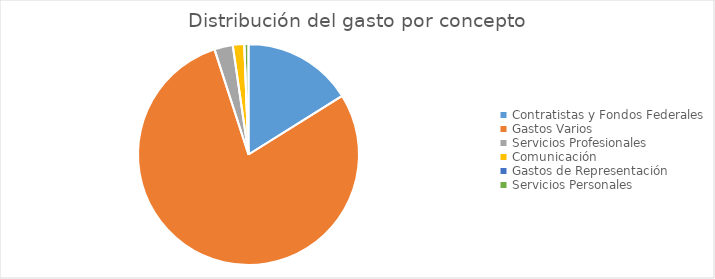
| Category | Series 0 |
|---|---|
| Contratistas y Fondos Federales | 98316882.19 |
| Gastos Varios | 482111982.7 |
| Servicios Profesionales | 16478488.29 |
| Comunicación | 10192887.81 |
| Gastos de Representación | 16675.76 |
| Servicios Personales | 3729580.85 |